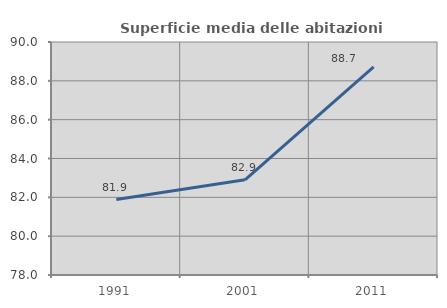
| Category | Superficie media delle abitazioni occupate |
|---|---|
| 1991.0 | 81.884 |
| 2001.0 | 82.903 |
| 2011.0 | 88.716 |